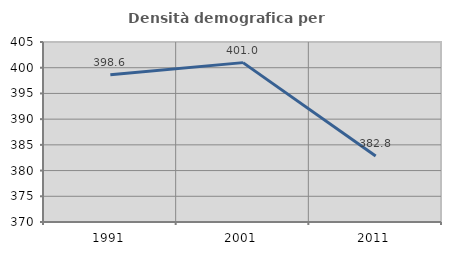
| Category | Densità demografica |
|---|---|
| 1991.0 | 398.61 |
| 2001.0 | 400.989 |
| 2011.0 | 382.822 |